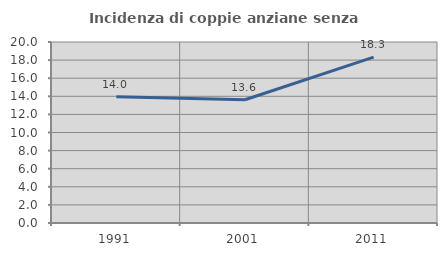
| Category | Incidenza di coppie anziane senza figli  |
|---|---|
| 1991.0 | 13.962 |
| 2001.0 | 13.619 |
| 2011.0 | 18.333 |